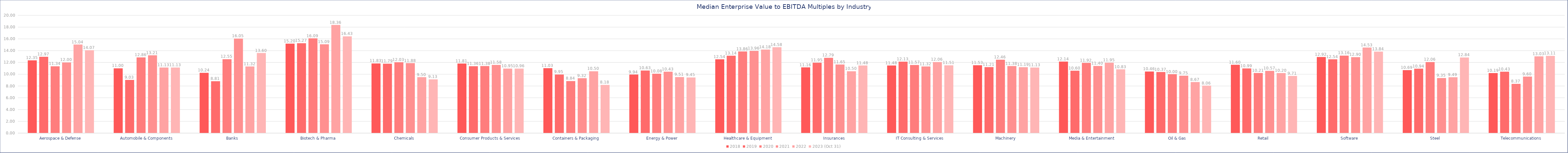
| Category | 2018 | 2019 | 2020 | 2021 | 2022 | 2023 (Oct 31) |
|---|---|---|---|---|---|---|
| Aerospace & Defense | 12.35 | 12.97 | 11.34 | 12 | 15.04 | 14.07 |
| Automobile & Components | 11 | 9.03 | 12.86 | 13.21 | 11.13 | 11.13 |
| Banks | 10.24 | 8.81 | 12.55 | 16.05 | 11.32 | 13.6 |
| Biotech & Pharma | 15.2 | 15.27 | 16.09 | 15.09 | 18.36 | 16.43 |
| Chemicals | 11.83 | 11.79 | 12.03 | 11.88 | 9.5 | 9.13 |
| Consumer Products & Services | 11.81 | 11.36 | 11.38 | 11.58 | 10.95 | 10.96 |
| Containers & Packaging | 11.03 | 9.95 | 8.84 | 9.32 | 10.5 | 8.18 |
| Energy & Power | 9.94 | 10.63 | 10.08 | 10.43 | 9.51 | 9.45 |
| Healthcare & Equipment | 12.54 | 13.14 | 13.86 | 13.96 | 14.18 | 14.58 |
| Insurances | 11.16 | 11.95 | 12.79 | 11.65 | 10.5 | 11.48 |
| IT Consulting & Services | 11.48 | 12.13 | 11.57 | 11.32 | 12.06 | 11.51 |
| Machinery | 11.53 | 11.21 | 12.46 | 11.38 | 11.19 | 11.13 |
| Media & Entertainment | 12.14 | 10.6 | 11.92 | 11.4 | 11.95 | 10.83 |
| Oil & Gas | 10.46 | 10.37 | 10 | 9.75 | 8.67 | 8.06 |
| Retail | 11.6 | 10.99 | 10.21 | 10.57 | 10.2 | 9.71 |
| Software | 12.92 | 12.54 | 13.16 | 12.9 | 14.53 | 13.84 |
| Steel | 10.69 | 10.94 | 12.06 | 9.35 | 9.49 | 12.84 |
| Telecommunications | 10.19 | 10.43 | 8.37 | 9.6 | 13.03 | 13.11 |